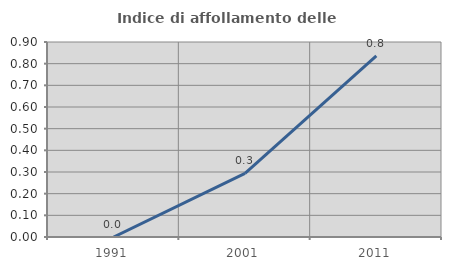
| Category | Indice di affollamento delle abitazioni  |
|---|---|
| 1991.0 | 0 |
| 2001.0 | 0.294 |
| 2011.0 | 0.836 |